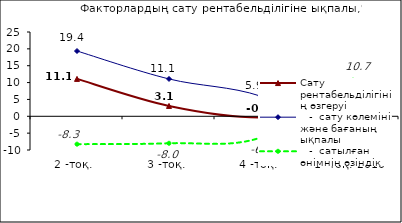
| Category | Сату рентабельділігінің өзгеруі |    -  сату көлемінің және бағаның ықпалы |    -  сатылған өнімнің өзіндік құнының ықпалы |
|---|---|---|---|
| 2 -тоқ.  | 11.092 | 19.362 | -8.27 |
| 3 -тоқ. | 3.07 | 11.073 | -8.004 |
| 4 -тоқ. | -0.337 | 5.937 | -6.275 |
| 1 -тоқ. 2010  | 3.441 | -7.261 | 10.702 |